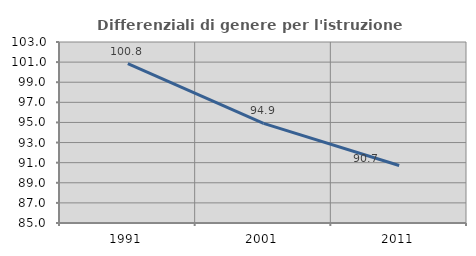
| Category | Differenziali di genere per l'istruzione superiore |
|---|---|
| 1991.0 | 100.843 |
| 2001.0 | 94.907 |
| 2011.0 | 90.718 |